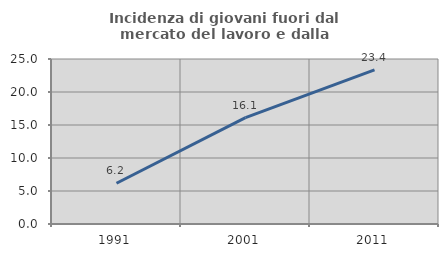
| Category | Incidenza di giovani fuori dal mercato del lavoro e dalla formazione  |
|---|---|
| 1991.0 | 6.18 |
| 2001.0 | 16.129 |
| 2011.0 | 23.364 |